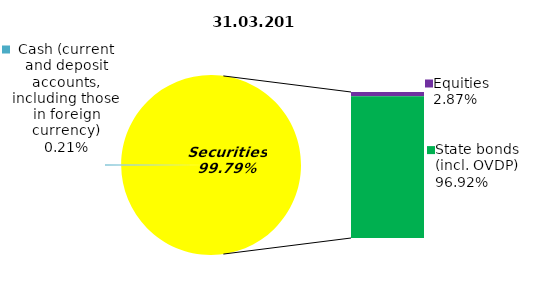
| Category | Series 0 |
|---|---|
| Cash (current and deposit accounts, including those in foreign currency) | 0.19 |
| Bank metals | 0 |
| Real estate | 0 |
| Other assets | 0 |
| Equities | 2.58 |
| Corporate bonds | 0 |
| Municipal bonds | 0 |
| State bonds (incl. OVDP) | 87.05 |
| Mortgage Certificates | 0 |